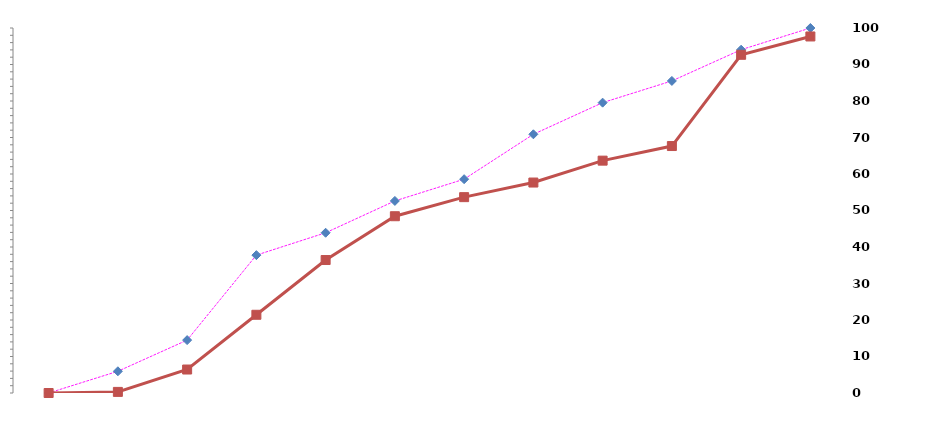
| Category | Series 0 | Series 1 |
|---|---|---|
| 0 | 0 | 0 |
| 1 | 5.95 | 0.3 |
| 2 | 14.49 | 6.43 |
| 3 | 37.77 | 21.43 |
| 4 | 43.9 | 36.43 |
| 5 | 52.62 | 48.43 |
| 6 | 58.58 | 53.66 |
| 7 | 70.88 | 57.66 |
| 8 | 79.55 | 63.66 |
| 9 | 85.5 | 67.66 |
| 10 | 94.05 | 92.66 |
| 11 | 100 | 97.68 |